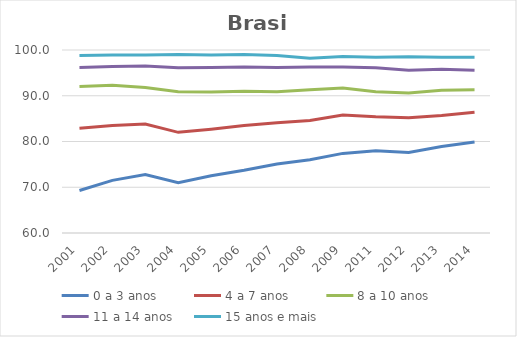
| Category | 0 a 3 anos | 4 a 7 anos | 8 a 10 anos | 11 a 14 anos | 15 anos e mais |
|---|---|---|---|---|---|
| 2001.0 | 69.3 | 82.9 | 92 | 96.2 | 98.8 |
| 2002.0 | 71.5 | 83.5 | 92.3 | 96.4 | 98.9 |
| 2003.0 | 72.8 | 83.8 | 91.8 | 96.5 | 98.9 |
| 2004.0 | 71 | 82 | 90.9 | 96.1 | 99 |
| 2005.0 | 72.5 | 82.7 | 90.8 | 96.2 | 98.9 |
| 2006.0 | 73.7 | 83.5 | 91 | 96.3 | 99 |
| 2007.0 | 75.1 | 84.1 | 90.9 | 96.2 | 98.8 |
| 2008.0 | 76 | 84.6 | 91.3 | 96.3 | 98.2 |
| 2009.0 | 77.4 | 85.8 | 91.7 | 96.3 | 98.6 |
| 2011.0 | 78 | 85.4 | 90.9 | 96.1 | 98.4 |
| 2012.0 | 77.6 | 85.2 | 90.6 | 95.6 | 98.5 |
| 2013.0 | 78.9 | 85.7 | 91.2 | 95.8 | 98.4 |
| 2014.0 | 79.9 | 86.4 | 91.3 | 95.6 | 98.4 |